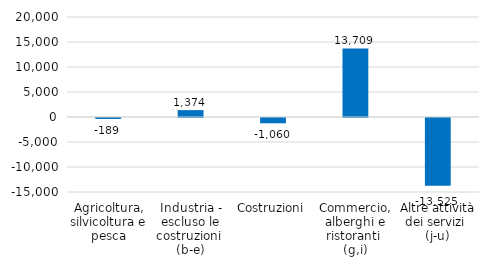
| Category | Series 0 |
|---|---|
| Agricoltura, silvicoltura e pesca | -189 |
| Industria - escluso le costruzioni 
(b-e) | 1374 |
| Costruzioni | -1060 |
| Commercio, alberghi e ristoranti 
(g,i) | 13709 |
| Altre attività dei servizi 
(j-u) | -13525 |